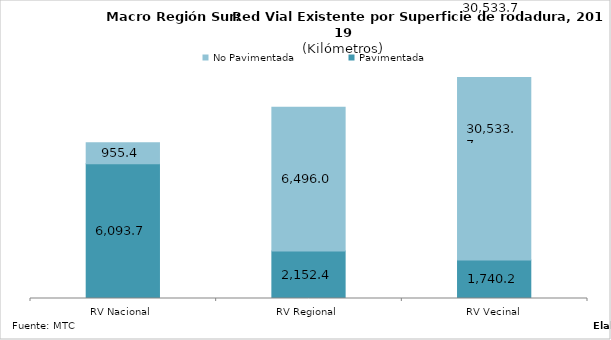
| Category | Pavimentada | No Pavimentada |
|---|---|---|
| RV Nacional | 6093.662 | 955.408 |
| RV Regional | 2152.39 | 6495.976 |
| RV Vecinal | 1740.17 | 30533.742 |